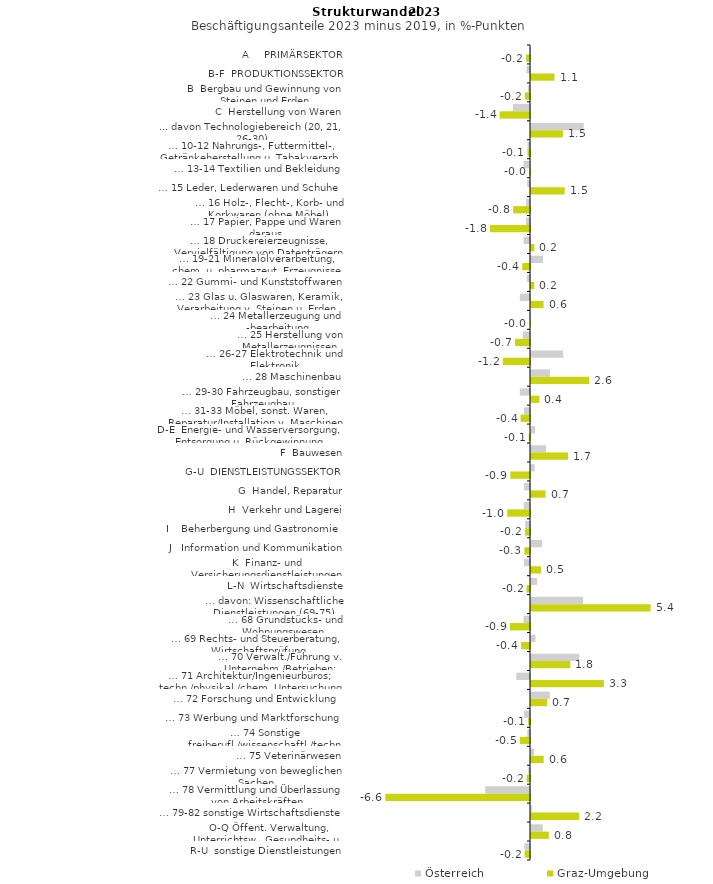
| Category | Österreich | Graz-Umgebung |
|---|---|---|
| A     PRIMÄRSEKTOR | -0.007 | -0.176 |
| B-F  PRODUKTIONSSEKTOR | -0.161 | 1.069 |
| B  Bergbau und Gewinnung von Steinen und Erden | -0.086 | -0.239 |
| C  Herstellung von Waren | -0.782 | -1.382 |
| ... davon Technologiebereich (20, 21, 26-30) | 2.393 | 1.451 |
| … 10-12 Nahrungs-, Futtermittel-, Getränkeherstellung u. Tabakverarb. | -0.116 | -0.116 |
| … 13-14 Textilien und Bekleidung | -0.289 | -0.04 |
| … 15 Leder, Lederwaren und Schuhe | -0.13 | 1.532 |
| … 16 Holz-, Flecht-, Korb- und Korkwaren (ohne Möbel)  | -0.177 | -0.767 |
| … 17 Papier, Pappe und Waren daraus  | -0.185 | -1.824 |
| … 18 Druckereierzeugnisse, Vervielfältigung von Datenträgern | -0.288 | 0.154 |
| … 19-21 Mineralölverarbeitung, chem. u. pharmazeut. Erzeugnisse | 0.549 | -0.353 |
| … 22 Gummi- und Kunststoffwaren | -0.139 | 0.15 |
| … 23 Glas u. Glaswaren, Keramik, Verarbeitung v. Steinen u. Erden  | -0.462 | 0.572 |
| … 24 Metallerzeugung und -bearbeitung | -0.032 | -0.001 |
| … 25 Herstellung von Metallerzeugnissen  | -0.325 | -0.679 |
| … 26-27 Elektrotechnik und Elektronik | 1.462 | -1.236 |
| … 28 Maschinenbau | 0.864 | 2.647 |
| … 29-30 Fahrzeugbau, sonstiger Fahrzeugbau | -0.462 | 0.385 |
| … 31-33 Möbel, sonst. Waren, Reparatur/Installation v. Maschinen | -0.273 | -0.426 |
| D-E  Energie- und Wasserversorgung, Entsorgung u. Rückgewinnung | 0.184 | -0.059 |
| F  Bauwesen | 0.684 | 1.685 |
| G-U  DIENSTLEISTUNGSSEKTOR | 0.167 | -0.893 |
| G  Handel, Reparatur | -0.273 | 0.666 |
| H  Verkehr und Lagerei | -0.287 | -1.036 |
| I    Beherbergung und Gastronomie | -0.218 | -0.23 |
| J   Information und Kommunikation | 0.499 | -0.255 |
| K  Finanz- und Versicherungsdienstleistungen | -0.279 | 0.454 |
| L-N  Wirtschaftsdienste | 0.279 | -0.158 |
| … davon: Wissenschaftliche Dienstleistungen (69-75) | 2.367 | 5.438 |
| … 68 Grundstücks- und Wohnungswesen  | -0.294 | -0.916 |
| … 69 Rechts- und Steuerberatung, Wirtschaftsprüfung | 0.205 | -0.403 |
| … 70 Verwalt./Führung v. Unternehm./Betrieben; Unternehmensberat. | 2.188 | 1.787 |
| … 71 Architektur/Ingenieurbüros; techn./physikal./chem. Untersuchung | -0.622 | 3.309 |
| … 72 Forschung und Entwicklung  | 0.854 | 0.73 |
| … 73 Werbung und Marktforschung | -0.273 | -0.086 |
| … 74 Sonstige freiberufl./wissenschaftl./techn. Tätigkeiten | -0.124 | -0.458 |
| … 75 Veterinärwesen | 0.14 | 0.576 |
| … 77 Vermietung von beweglichen Sachen  | -0.077 | -0.15 |
| … 78 Vermittlung und Überlassung von Arbeitskräften | -2.035 | -6.575 |
| … 79-82 sonstige Wirtschaftsdienste | 0.039 | 2.188 |
| O-Q Öffent. Verwaltung, Unterrichtsw., Gesundheits- u. Sozialwesen | 0.535 | 0.809 |
| R-U  sonstige Dienstleistungen | -0.256 | -0.244 |